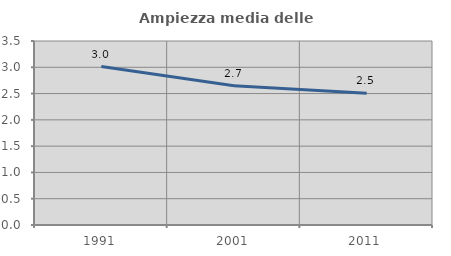
| Category | Ampiezza media delle famiglie |
|---|---|
| 1991.0 | 3.014 |
| 2001.0 | 2.65 |
| 2011.0 | 2.504 |